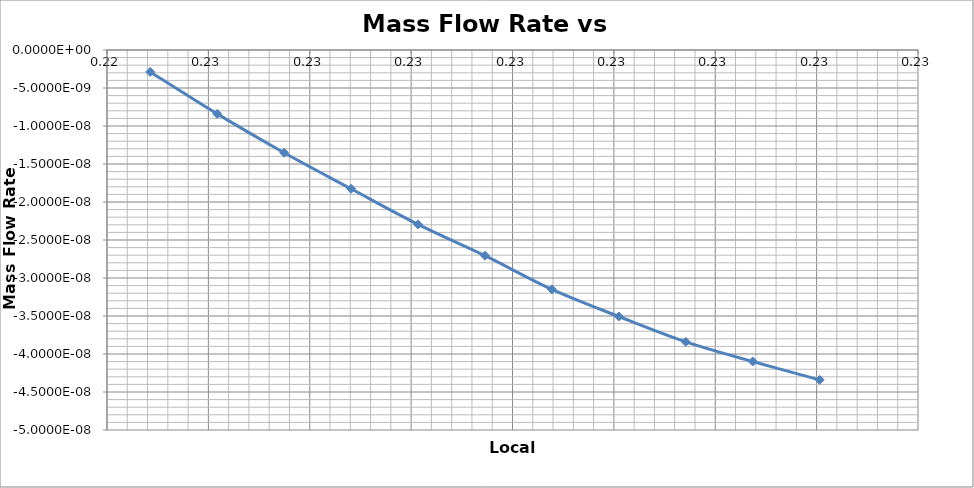
| Category | Series 0 |
|---|---|
| 0.2244263508512213 | 0 |
| 0.22508673937808493 | 0 |
| 0.22574712790494852 | 0 |
| 0.22640751643181212 | 0 |
| 0.2270679049586757 | 0 |
| 0.22772829348553933 | 0 |
| 0.22838868201240292 | 0 |
| 0.2290490705392665 | 0 |
| 0.22970945906613013 | 0 |
| 0.23036984759299373 | 0 |
| 0.23103023611985732 | 0 |